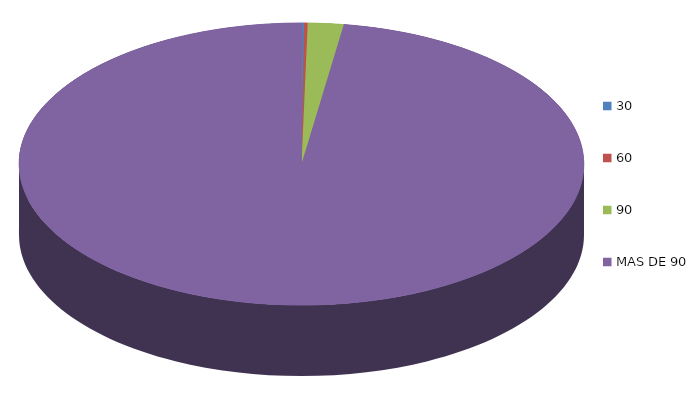
| Category | Series 0 | 64,616.6 |
|---|---|---|
| 0 | 64616.6 |  |
| 1 | 92320.9 |  |
| 2 | 917211.3 |  |
| 3 | 43801368 |  |